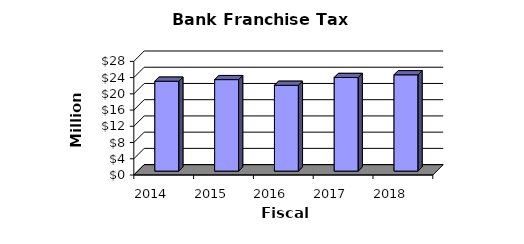
| Category | Series 0 |
|---|---|
| 2014.0 | 22149000 |
| 2015.0 | 22539000 |
| 2016.0 | 21142000 |
| 2017.0 | 23068000 |
| 2018.0 | 23724800 |